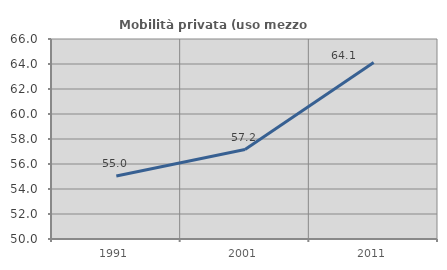
| Category | Mobilità privata (uso mezzo privato) |
|---|---|
| 1991.0 | 55.041 |
| 2001.0 | 57.158 |
| 2011.0 | 64.111 |